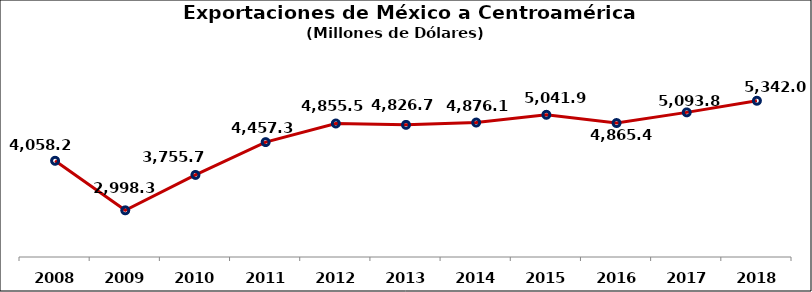
| Category | Exportaciones de México a Centroamérica (Millones USD) |
|---|---|
| 2008 | 4058.2 |
| 2009 | 2998.3 |
| 2010 | 3755.7 |
| 2011 | 4457.3 |
| 2012 | 4855.5 |
| 2013 | 4826.7 |
| 2014 | 4876.1 |
| 2015 | 5041.9 |
| 2016 | 4865.4 |
| 2017 | 5093.8 |
| 2018 | 5342 |